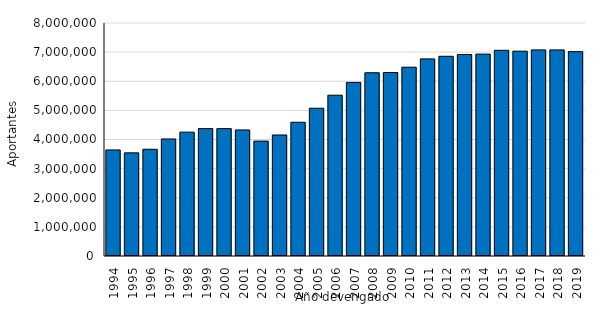
| Category | Demora en el pago hasta 12 meses |
|---|---|
| 1994.0 | 3641898 |
| 1995.0 | 3540967 |
| 1996.0 | 3664904 |
| 1997.0 | 4019165 |
| 1998.0 | 4253063 |
| 1999.0 | 4374796 |
| 2000.0 | 4374378 |
| 2001.0 | 4327807 |
| 2002.0 | 3945082 |
| 2003.0 | 4155410 |
| 2004.0 | 4592049 |
| 2005.0 | 5073930 |
| 2006.0 | 5520906 |
| 2007.0 | 5960080 |
| 2008.0 | 6291484 |
| 2009.0 | 6300186 |
| 2010.0 | 6482639 |
| 2011.0 | 6768227 |
| 2012.0 | 6856910 |
| 2013.0 | 6918139 |
| 2014.0 | 6931439 |
| 2015.0 | 7062746 |
| 2016.0 | 7032247 |
| 2017.0 | 7076572 |
| 2018.0 | 7077079 |
| 2019.0 | 7017146 |